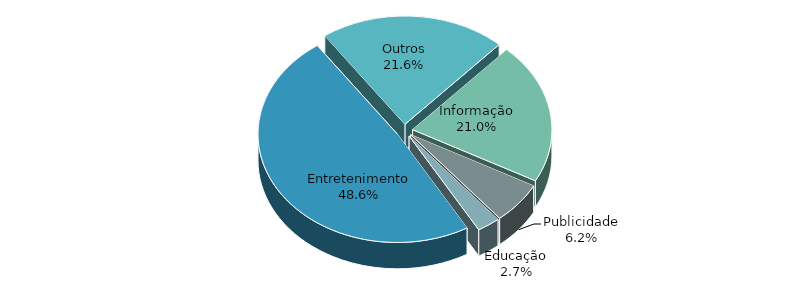
| Category | Series 0 |
|---|---|
| Entretenimento | 0.486 |
| Outros | 0.216 |
| Informação | 0.21 |
| Publicidade | 0.062 |
| Educação | 0.027 |